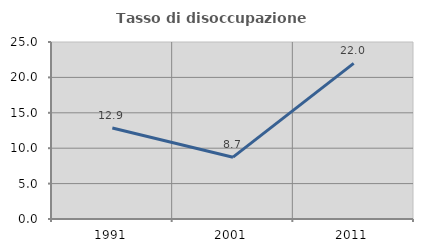
| Category | Tasso di disoccupazione giovanile  |
|---|---|
| 1991.0 | 12.852 |
| 2001.0 | 8.732 |
| 2011.0 | 21.973 |